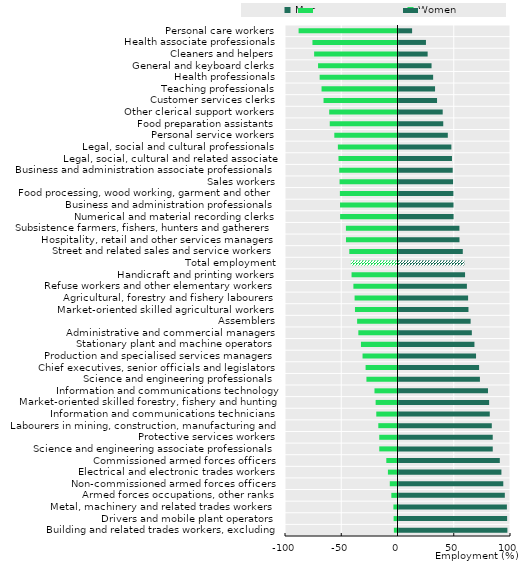
| Category | Men | Women |
|---|---|---|
| Building and related trades workers, excluding electricians | 96.79 | -3.21 |
| Drivers and mobile plant operators | 96.55 | -3.45 |
| Metal, machinery and related trades workers | 96.36 | -3.64 |
| Armed forces occupations, other ranks | 94.51 | -5.49 |
| Non-commissioned armed forces officers | 93.14 | -6.86 |
| Electrical and electronic trades workers | 91.48 | -8.52 |
| Commissioned armed forces officers | 90.05 | -9.95 |
| Science and engineering associate professionals | 83.78 | -16.22 |
| Protective services workers | 83.77 | -16.23 |
| Labourers in mining, construction, manufacturing and transport | 82.93 | -17.07 |
| Information and communications technicians | 81.13 | -18.87 |
| Market-oriented skilled forestry, fishery and hunting workers | 80.56 | -19.44 |
| Information and communications technology professionals | 79.54 | -20.46 |
| Science and engineering professionals | 72.38 | -27.62 |
| Chief executives, senior officials and legislators | 71.64 | -28.36 |
| Production and specialised services managers | 68.93 | -31.07 |
| Stationary plant and machine operators | 67.5 | -32.5 |
| Administrative and commercial managers | 65.19 | -34.81 |
| Assemblers | 64.11 | -35.89 |
| Market-oriented skilled agricultural workers | 62.19 | -37.81 |
| Agricultural, forestry and fishery labourers | 61.87 | -38.13 |
| Refuse workers and other elementary workers | 60.8 | -39.2 |
| Handicraft and printing workers | 59.16 | -40.84 |
| Total employment | 58.53 | -41.47 |
| Street and related sales and service workers | 57.15 | -42.85 |
| Hospitality, retail and other services managers | 54.21 | -45.79 |
| Subsistence farmers, fishers, hunters and gatherers | 54.15 | -45.85 |
| Numerical and material recording clerks | 48.97 | -51.03 |
| Business and administration professionals | 48.9 | -51.1 |
| Food processing, wood working, garment and other | 48.78 | -51.22 |
| Sales workers | 48.5 | -51.5 |
| Business and administration associate professionals | 48.19 | -51.81 |
| Legal, social, cultural and related associate professionals | 47.54 | -52.46 |
| Legal, social and cultural professionals | 47 | -53 |
| Personal service workers | 43.83 | -56.17 |
| Food preparation assistants | 39.78 | -60.22 |
| Other clerical support workers | 39.29 | -60.71 |
| Customer services clerks | 34.26 | -65.74 |
| Teaching professionals | 32.49 | -67.51 |
| Health professionals | 30.79 | -69.21 |
| General and keyboard clerks | 29.38 | -70.62 |
| Cleaners and helpers | 25.9 | -74.1 |
| Health associate professionals | 24.4 | -75.6 |
| Personal care workers | 12.09 | -87.91 |